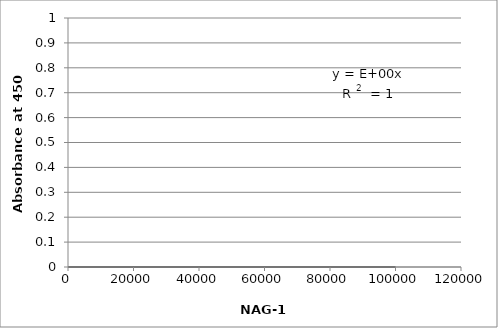
| Category | Series 0 |
|---|---|
| 100000.0 | 0 |
| 10000.0 | 0 |
| 1000.0 | 0 |
| 100.0 | 0 |
| 10.0 | 0 |
| 1.0 | 0 |